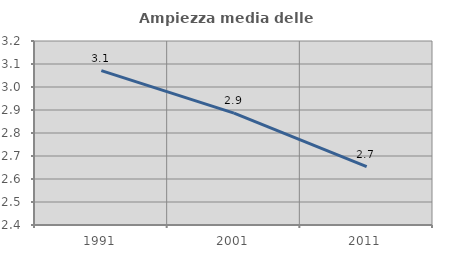
| Category | Ampiezza media delle famiglie |
|---|---|
| 1991.0 | 3.071 |
| 2001.0 | 2.887 |
| 2011.0 | 2.654 |